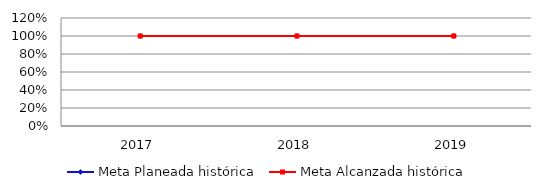
| Category | Meta Planeada histórica | Meta Alcanzada histórica |
|---|---|---|
| 0 | 1 | 1 |
| 1 | 1 | 1 |
| 2 | 1 | 1 |